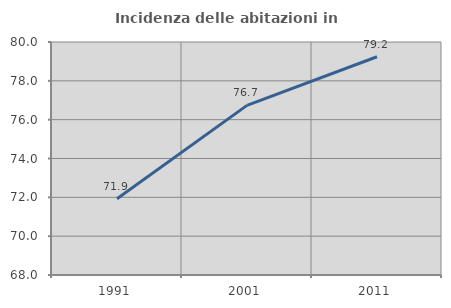
| Category | Incidenza delle abitazioni in proprietà  |
|---|---|
| 1991.0 | 71.928 |
| 2001.0 | 76.736 |
| 2011.0 | 79.241 |